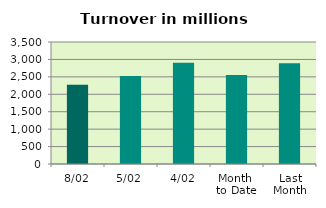
| Category | Series 0 |
|---|---|
| 8/02 | 2270.759 |
| 5/02 | 2523.709 |
| 4/02 | 2901.681 |
| Month 
to Date | 2550.577 |
| Last
Month | 2888.221 |